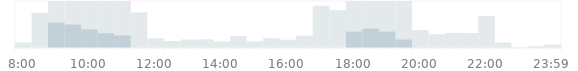
| Category | Управление | Series 1 | Series 2 | Series 3 |
|---|---|---|---|---|
| 0.333333333333333 | 87 | 0 | 0 | 0 |
| nan | 563 | 0 | 0 | 0 |
| nan | 750 | 406 | 0 | 0 |
| nan | 750 | 373 | 0 | 0 |
| 0.416666666666667 | 750 | 296 | 0 | 0 |
| nan | 750 | 235 | 0 | 0 |
| nan | 750 | 200 | 0 | 0 |
| nan | 567 | 0 | 0 | 0 |
| 0.5 | 156 | 0 | 0 | 0 |
| nan | 111 | 0 | 0 | 0 |
| nan | 135 | 0 | 0 | 0 |
| nan | 138 | 0 | 0 | 0 |
| 0.583333333333333 | 103 | 0 | 0 | 0 |
| nan | 188 | 0 | 0 | 0 |
| nan | 106 | 0 | 0 | 0 |
| nan | 157 | 0 | 0 | 0 |
| 0.666666666666667 | 131 | 0 | 0 | 0 |
| nan | 197 | 0 | 0 | 0 |
| nan | 674 | 0 | 0 | 0 |
| nan | 603 | 0 | 0 | 0 |
| 0.75 | 750 | 260 | 0 | 0 |
| nan | 750 | 308 | 0 | 0 |
| nan | 750 | 262 | 0 | 0 |
| nan | 750 | 136 | 0 | 0 |
| 0.833333333333333 | 287 | 0 | 0 | 0 |
| nan | 219 | 0 | 0 | 0 |
| nan | 241 | 0 | 0 | 0 |
| nan | 240 | 0 | 0 | 0 |
| 0.916666666666667 | 512 | 0 | 0 | 0 |
| nan | 85 | 0 | 0 | 0 |
| nan | 6 | 0 | 0 | 0 |
| nan | 27 | 0 | 0 | 0 |
| 0.9993055555555556 | 54 | 0 | 0 | 0 |